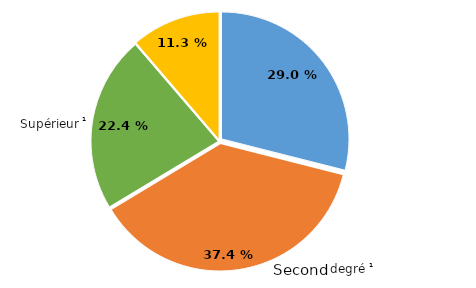
| Category | Series 0 |
|---|---|
| Premier degré | 0.29 |
| Second degré¹ | 0.374 |
| Supérieur¹ | 0.224 |
| Extrascolaire² | 0.113 |